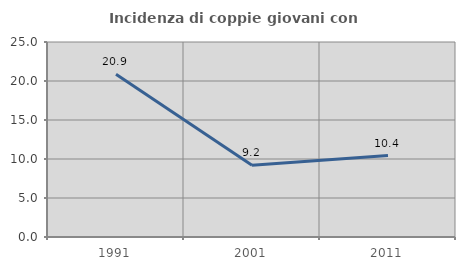
| Category | Incidenza di coppie giovani con figli |
|---|---|
| 1991.0 | 20.87 |
| 2001.0 | 9.205 |
| 2011.0 | 10.442 |